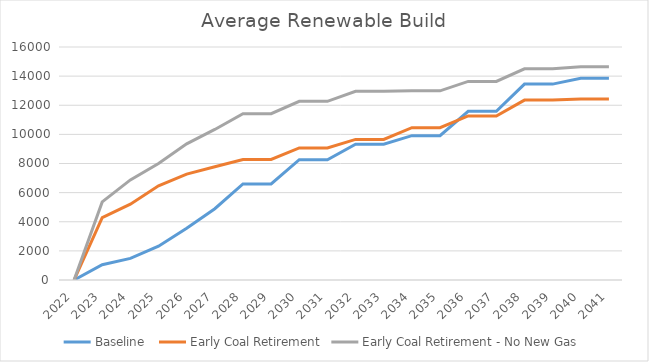
| Category | Baseline  | Early Coal Retirement | Early Coal Retirement - No New Gas |
|---|---|---|---|
| 2022.0 | 0 | 0 | 0 |
| 2023.0 | 1046.583 | 4276.68 | 5362 |
| 2024.0 | 1483.527 | 5204.68 | 6872.933 |
| 2025.0 | 2321.86 | 6464.68 | 8004.267 |
| 2026.0 | 3560.527 | 7272.68 | 9350.267 |
| 2027.0 | 4896.14 | 7773.24 | 10338.933 |
| 2028.0 | 6593.403 | 8279.007 | 11424.427 |
| 2029.0 | 6593.403 | 8279.007 | 11424.427 |
| 2030.0 | 8261.437 | 9065.607 | 12270.683 |
| 2031.0 | 8261.437 | 9065.607 | 12270.683 |
| 2032.0 | 9323.357 | 9656.273 | 12961.77 |
| 2033.0 | 9323.357 | 9656.273 | 12961.77 |
| 2034.0 | 9910.52 | 10458.533 | 12990.17 |
| 2035.0 | 9910.52 | 10458.533 | 12990.17 |
| 2036.0 | 11585.51 | 11266.283 | 13638.17 |
| 2037.0 | 11585.51 | 11266.283 | 13638.17 |
| 2038.0 | 13451.81 | 12353.337 | 14503.61 |
| 2039.0 | 13451.81 | 12353.337 | 14503.61 |
| 2040.0 | 13857.41 | 12422.803 | 14649.77 |
| 2041.0 | 13857.41 | 12422.803 | 14649.77 |